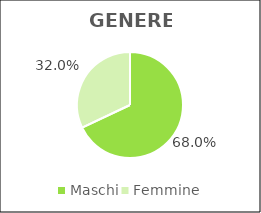
| Category | Series 0 |
|---|---|
| Maschi | 47227 |
| Femmine | 22266 |